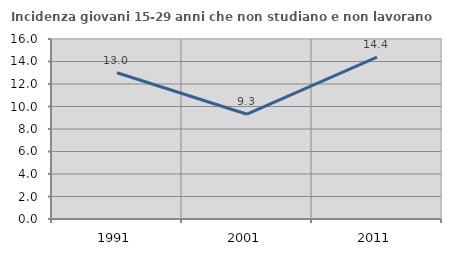
| Category | Incidenza giovani 15-29 anni che non studiano e non lavorano  |
|---|---|
| 1991.0 | 13 |
| 2001.0 | 9.314 |
| 2011.0 | 14.384 |